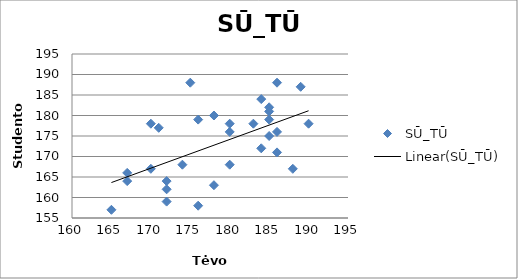
| Category | SŪ_TŪ |
|---|---|
| 167.0 | 164 |
| 167.0 | 166 |
| 180.0 | 178 |
| 184.0 | 172 |
| 180.0 | 176 |
| 190.0 | 178 |
| 185.0 | 182 |
| 172.0 | 162 |
| 184.0 | 184 |
| 185.0 | 179 |
| 186.0 | 188 |
| 183.0 | 178 |
| 185.0 | 175 |
| 176.0 | 179 |
| 178.0 | 163 |
| 175.0 | 188 |
| 189.0 | 187 |
| 172.0 | 164 |
| 186.0 | 171 |
| 172.0 | 159 |
| 165.0 | 157 |
| 178.0 | 180 |
| 176.0 | 158 |
| 180.0 | 168 |
| 170.0 | 178 |
| 171.0 | 177 |
| 185.0 | 181 |
| 170.0 | 167 |
| 174.0 | 168 |
| 186.0 | 176 |
| 188.0 | 167 |